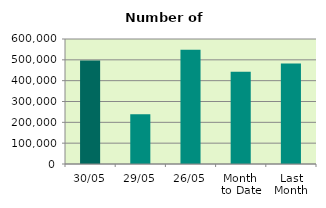
| Category | Series 0 |
|---|---|
| 30/05 | 496984 |
| 29/05 | 238812 |
| 26/05 | 548016 |
| Month 
to Date | 442501.524 |
| Last
Month | 481931.444 |